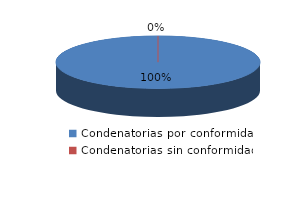
| Category | Series 0 |
|---|---|
| 0 | 44 |
| 1 | 0 |